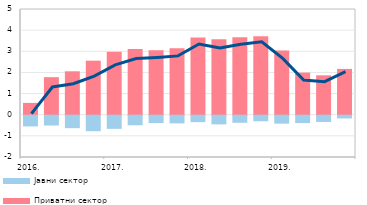
| Category | Приватни сектор | Јавни сектор |
|---|---|---|
| 2016. | 0.559 | -0.507 |
| II | 1.776 | -0.463 |
| III | 2.053 | -0.589 |
| IV | 2.556 | -0.733 |
| 2017. | 2.977 | -0.621 |
| II | 3.109 | -0.452 |
| III | 3.055 | -0.347 |
| IV | 3.145 | -0.363 |
| 2018. | 3.649 | -0.305 |
| II | 3.567 | -0.411 |
| III | 3.668 | -0.334 |
| IV | 3.71 | -0.263 |
| 2019. | 3.039 | -0.375 |
| II | 1.992 | -0.349 |
| III | 1.862 | -0.298 |
| IV | 2.168 | -0.13 |